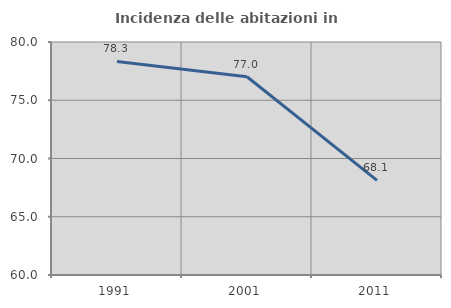
| Category | Incidenza delle abitazioni in proprietà  |
|---|---|
| 1991.0 | 78.333 |
| 2001.0 | 77.016 |
| 2011.0 | 68.122 |